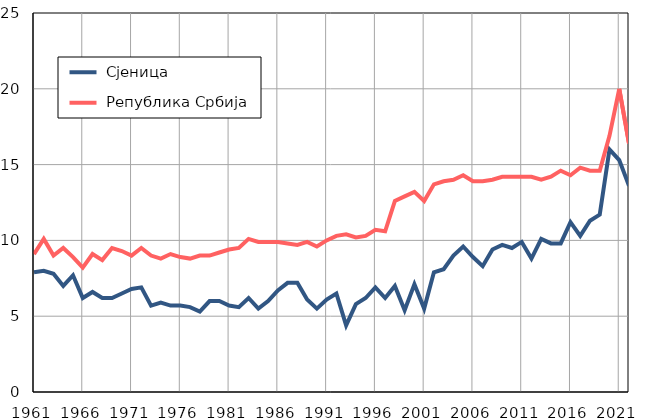
| Category |  Сјеница |  Република Србија |
|---|---|---|
| 1961.0 | 7.9 | 9.1 |
| 1962.0 | 8 | 10.1 |
| 1963.0 | 7.8 | 9 |
| 1964.0 | 7 | 9.5 |
| 1965.0 | 7.7 | 8.9 |
| 1966.0 | 6.2 | 8.2 |
| 1967.0 | 6.6 | 9.1 |
| 1968.0 | 6.2 | 8.7 |
| 1969.0 | 6.2 | 9.5 |
| 1970.0 | 6.5 | 9.3 |
| 1971.0 | 6.8 | 9 |
| 1972.0 | 6.9 | 9.5 |
| 1973.0 | 5.7 | 9 |
| 1974.0 | 5.9 | 8.8 |
| 1975.0 | 5.7 | 9.1 |
| 1976.0 | 5.7 | 8.9 |
| 1977.0 | 5.6 | 8.8 |
| 1978.0 | 5.3 | 9 |
| 1979.0 | 6 | 9 |
| 1980.0 | 6 | 9.2 |
| 1981.0 | 5.7 | 9.4 |
| 1982.0 | 5.6 | 9.5 |
| 1983.0 | 6.2 | 10.1 |
| 1984.0 | 5.5 | 9.9 |
| 1985.0 | 6 | 9.9 |
| 1986.0 | 6.7 | 9.9 |
| 1987.0 | 7.2 | 9.8 |
| 1988.0 | 7.2 | 9.7 |
| 1989.0 | 6.1 | 9.9 |
| 1990.0 | 5.5 | 9.6 |
| 1991.0 | 6.1 | 10 |
| 1992.0 | 6.5 | 10.3 |
| 1993.0 | 4.4 | 10.4 |
| 1994.0 | 5.8 | 10.2 |
| 1995.0 | 6.2 | 10.3 |
| 1996.0 | 6.9 | 10.7 |
| 1997.0 | 6.2 | 10.6 |
| 1998.0 | 7 | 12.6 |
| 1999.0 | 5.4 | 12.9 |
| 2000.0 | 7.1 | 13.2 |
| 2001.0 | 5.5 | 12.6 |
| 2002.0 | 7.9 | 13.7 |
| 2003.0 | 8.1 | 13.9 |
| 2004.0 | 9 | 14 |
| 2005.0 | 9.6 | 14.3 |
| 2006.0 | 8.9 | 13.9 |
| 2007.0 | 8.3 | 13.9 |
| 2008.0 | 9.4 | 14 |
| 2009.0 | 9.7 | 14.2 |
| 2010.0 | 9.5 | 14.2 |
| 2011.0 | 9.9 | 14.2 |
| 2012.0 | 8.8 | 14.2 |
| 2013.0 | 10.1 | 14 |
| 2014.0 | 9.8 | 14.2 |
| 2015.0 | 9.8 | 14.6 |
| 2016.0 | 11.2 | 14.3 |
| 2017.0 | 10.3 | 14.8 |
| 2018.0 | 11.3 | 14.6 |
| 2019.0 | 11.7 | 14.6 |
| 2020.0 | 16 | 16.9 |
| 2021.0 | 15.3 | 20 |
| 2022.0 | 13.6 | 16.4 |